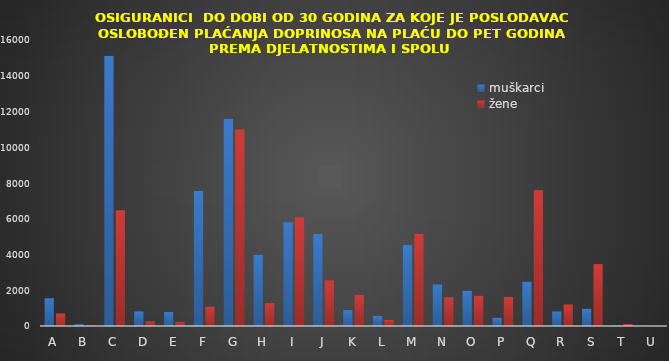
| Category | muškarci | žene |
|---|---|---|
| A | 1553 | 700 |
| B | 100 | 17 |
| C | 15114 | 6477 |
| D | 817 | 258 |
| E | 786 | 234 |
| F | 7555 | 1090 |
| G | 11595 | 10997 |
| H | 3991 | 1280 |
| I | 5799 | 6070 |
| J | 5147 | 2551 |
| K | 888 | 1748 |
| L | 563 | 348 |
| M | 4550 | 5168 |
| N | 2323 | 1605 |
| O | 1982 | 1704 |
| P | 459 | 1632 |
| Q | 2486 | 7594 |
| R | 811 | 1207 |
| S | 970 | 3460 |
| T | 17 | 109 |
| U | 3 | 5 |